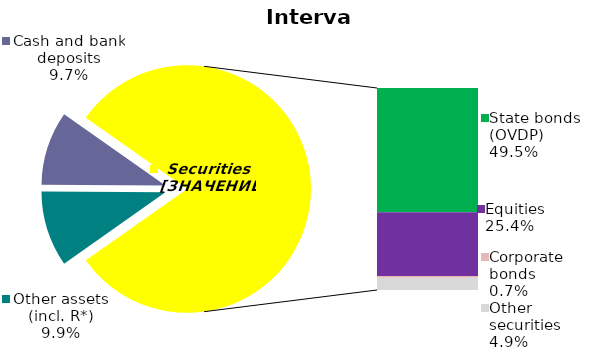
| Category | Series 0 |
|---|---|
| Other assets (incl. R*) | 0.099 |
| Cash and bank deposits | 0.097 |
| Bank metals | 0 |
| State bonds (OVDP) | 0.495 |
| Municipal bonds | 0 |
| Equities | 0.254 |
| Corporate bonds | 0.007 |
| Other securities | 0.049 |